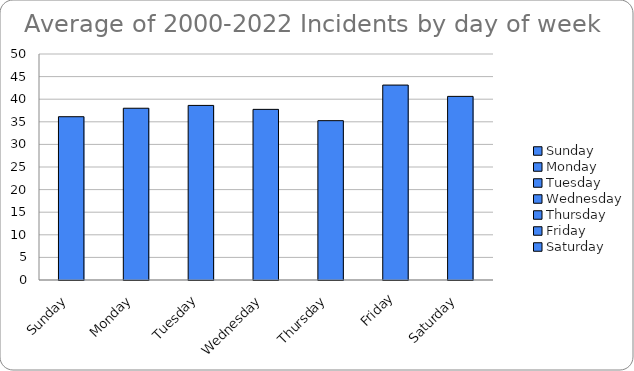
| Category | Series 0 |
|---|---|
| Sunday | 36.125 |
| Monday | 38 |
| Tuesday | 38.625 |
| Wednesday | 37.75 |
| Thursday | 35.25 |
| Friday | 43.125 |
| Saturday | 40.625 |